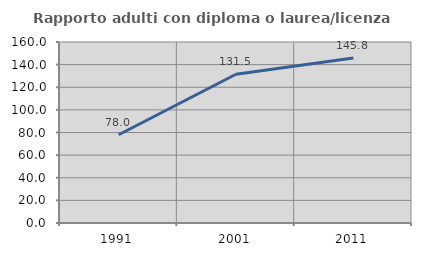
| Category | Rapporto adulti con diploma o laurea/licenza media  |
|---|---|
| 1991.0 | 78.035 |
| 2001.0 | 131.492 |
| 2011.0 | 145.771 |